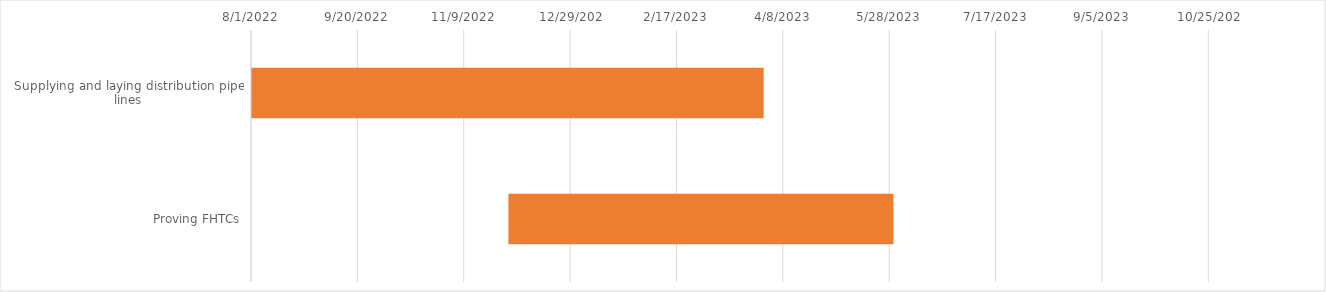
| Category | Start Date | 353 181 |
|---|---|---|
| Supplying and laying distribution pipe lines | 2022-04-11 | 353 |
| Proving FHTCs | 2022-11-30 | 181 |